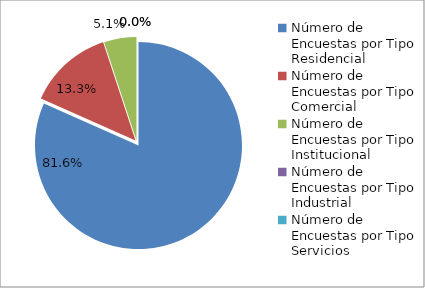
| Category | Series 0 |
|---|---|
| 0 | 129 |
| 1 | 21 |
| 2 | 8 |
| 3 | 0 |
| 4 | 0 |